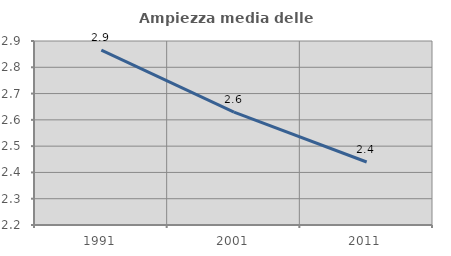
| Category | Ampiezza media delle famiglie |
|---|---|
| 1991.0 | 2.865 |
| 2001.0 | 2.629 |
| 2011.0 | 2.44 |